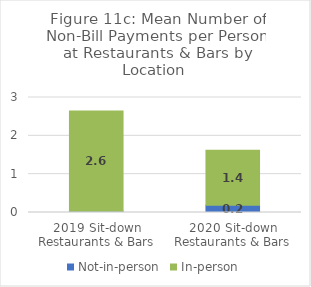
| Category | Not-in-person | In-person |
|---|---|---|
| 2019 Sit-down Restaurants & Bars | 0.031 | 2.614 |
| 2020 Sit-down Restaurants & Bars | 0.188 | 1.436 |